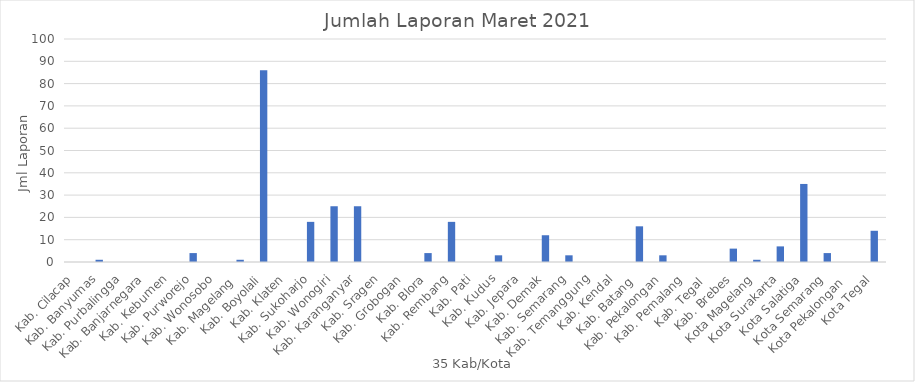
| Category | Series 0 |
|---|---|
| Kab. Cilacap | 0 |
| Kab. Banyumas | 1 |
| Kab. Purbalingga | 0 |
| Kab. Banjarnegara | 0 |
| Kab. Kebumen | 0 |
| Kab. Purworejo | 4 |
| Kab. Wonosobo | 0 |
| Kab. Magelang  | 1 |
| Kab. Boyolali | 86 |
| Kab. Klaten | 0 |
| Kab. Sukoharjo | 18 |
| Kab. Wonogiri | 25 |
| Kab. Karanganyar | 25 |
| Kab. Sragen | 0 |
| Kab. Grobogan | 0 |
| Kab. Blora | 4 |
| Kab. Rembang | 18 |
| Kab. Pati | 0 |
| Kab. Kudus | 3 |
| Kab. Jepara | 0 |
| Kab. Demak | 12 |
| Kab. Semarang | 3 |
| Kab. Temanggung | 0 |
| Kab. Kendal | 0 |
| Kab. Batang  | 16 |
| Kab. Pekalongan | 3 |
| Kab. Pemalang | 0 |
| Kab. Tegal  | 0 |
| Kab. Brebes | 6 |
| Kota Magelang | 1 |
| Kota Surakarta | 7 |
| Kota Salatiga | 35 |
| Kota Semarang | 4 |
| Kota Pekalongan  | 0 |
| Kota Tegal | 14 |